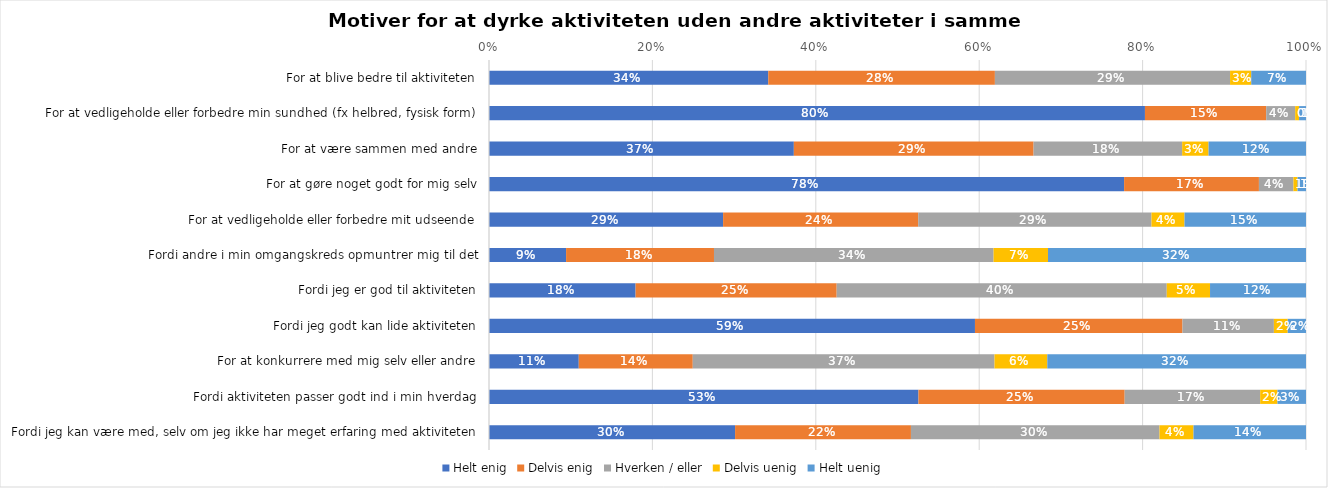
| Category | Helt enig | Delvis enig | Hverken / eller | Delvis uenig | Helt uenig |
|---|---|---|---|---|---|
| For at blive bedre til aktiviteten | 0.342 | 0.277 | 0.288 | 0.026 | 0.067 |
| For at vedligeholde eller forbedre min sundhed (fx helbred, fysisk form) | 0.803 | 0.148 | 0.035 | 0.005 | 0.009 |
| For at være sammen med andre | 0.373 | 0.293 | 0.182 | 0.032 | 0.119 |
| For at gøre noget godt for mig selv | 0.777 | 0.165 | 0.042 | 0.005 | 0.01 |
| For at vedligeholde eller forbedre mit udseende | 0.287 | 0.239 | 0.286 | 0.04 | 0.149 |
| Fordi andre i min omgangskreds opmuntrer mig til det | 0.094 | 0.181 | 0.342 | 0.067 | 0.316 |
| Fordi jeg er god til aktiviteten | 0.179 | 0.246 | 0.404 | 0.053 | 0.117 |
| Fordi jeg godt kan lide aktiviteten | 0.595 | 0.254 | 0.112 | 0.017 | 0.022 |
| For at konkurrere med mig selv eller andre | 0.11 | 0.14 | 0.369 | 0.065 | 0.317 |
| Fordi aktiviteten passer godt ind i min hverdag | 0.526 | 0.252 | 0.166 | 0.021 | 0.035 |
| Fordi jeg kan være med, selv om jeg ikke har meget erfaring med aktiviteten | 0.301 | 0.215 | 0.304 | 0.042 | 0.138 |